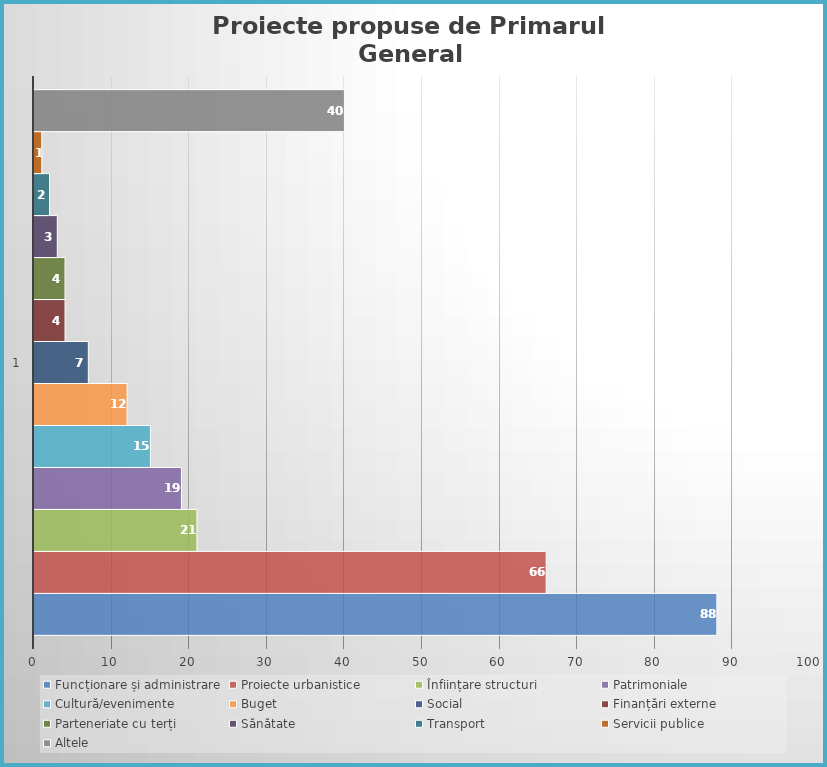
| Category | Funcționare și administrare | Proiecte urbanistice | Înființare structuri | Patrimoniale | Cultură/evenimente | Buget | Social | Finanțări externe | Parteneriate cu terți | Sănătate | Transport | Servicii publice | Altele |
|---|---|---|---|---|---|---|---|---|---|---|---|---|---|
| 0 | 88 | 66 | 21 | 19 | 15 | 12 | 7 | 4 | 4 | 3 | 2 | 1 | 40 |